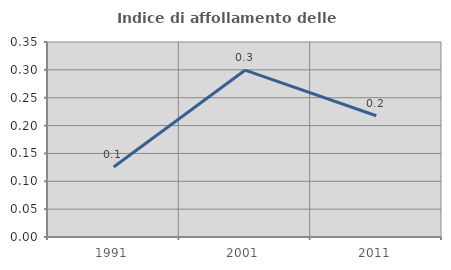
| Category | Indice di affollamento delle abitazioni  |
|---|---|
| 1991.0 | 0.126 |
| 2001.0 | 0.299 |
| 2011.0 | 0.218 |